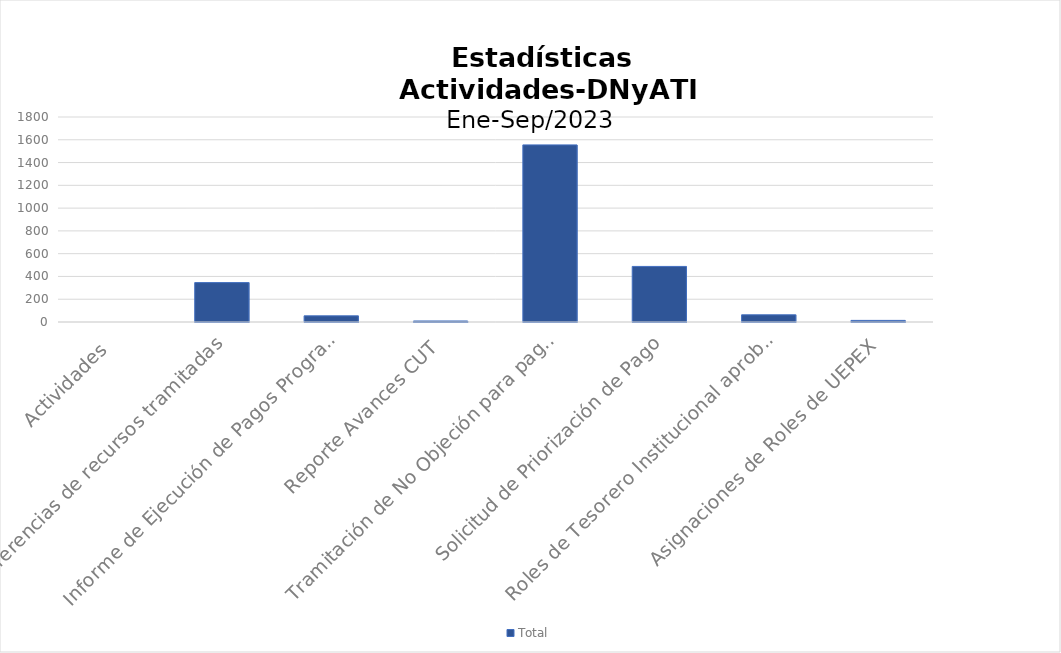
| Category | Total |
|---|---|
| Actividades | 0 |
| Transferencias de recursos tramitadas | 346 |
| Informe de Ejecución de Pagos Programa de Edificaciones Escolares | 54 |
| Reporte Avances CUT  | 9 |
| Tramitación de No Objeción para pagos vencidos | 1555 |
| Solicitud de Priorización de Pago | 488 |
| Roles de Tesorero Institucional aprobados y tramitados | 63 |
| Asignaciones de Roles de UEPEX | 14 |